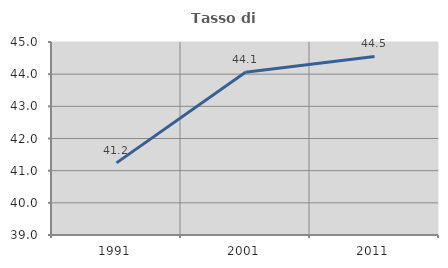
| Category | Tasso di occupazione   |
|---|---|
| 1991.0 | 41.242 |
| 2001.0 | 44.058 |
| 2011.0 | 44.55 |